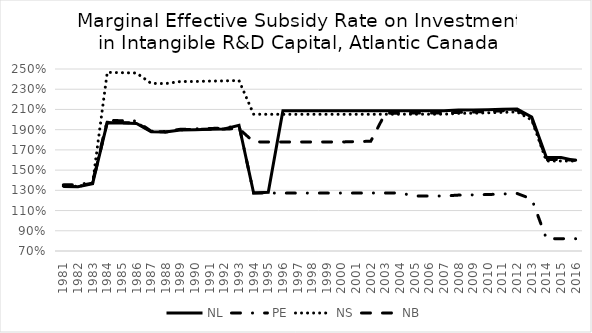
| Category | NL | PE | NS | NB |
|---|---|---|---|---|
| 1981.0 | 1.339 | 1.354 | 1.346 | 1.342 |
| 1982.0 | 1.336 | 1.354 | 1.339 | 1.342 |
| 1983.0 | 1.366 | 1.382 | 1.369 | 1.372 |
| 1984.0 | 1.97 | 1.992 | 2.467 | 1.974 |
| 1985.0 | 1.966 | 1.989 | 2.463 | 1.97 |
| 1986.0 | 1.962 | 1.986 | 2.46 | 1.966 |
| 1987.0 | 1.88 | 1.885 | 2.358 | 1.885 |
| 1988.0 | 1.877 | 1.883 | 2.356 | 1.877 |
| 1989.0 | 1.897 | 1.904 | 2.376 | 1.9 |
| 1990.0 | 1.9 | 1.908 | 2.376 | 1.904 |
| 1991.0 | 1.904 | 1.912 | 2.38 | 1.904 |
| 1992.0 | 1.906 | 1.914 | 2.382 | 1.906 |
| 1993.0 | 1.943 | 1.943 | 2.386 | 1.91 |
| 1994.0 | 1.274 | 1.274 | 2.053 | 1.779 |
| 1995.0 | 1.281 | 1.273 | 2.052 | 1.778 |
| 1996.0 | 2.087 | 1.273 | 2.052 | 1.778 |
| 1997.0 | 2.087 | 1.273 | 2.052 | 1.778 |
| 1998.0 | 2.087 | 1.273 | 2.052 | 1.778 |
| 1999.0 | 2.087 | 1.273 | 2.052 | 1.778 |
| 2000.0 | 2.087 | 1.273 | 2.052 | 1.778 |
| 2001.0 | 2.087 | 1.273 | 2.052 | 1.782 |
| 2002.0 | 2.088 | 1.273 | 2.052 | 1.785 |
| 2003.0 | 2.088 | 1.274 | 2.053 | 2.063 |
| 2004.0 | 2.088 | 1.274 | 2.053 | 2.064 |
| 2005.0 | 2.088 | 1.244 | 2.053 | 2.064 |
| 2006.0 | 2.088 | 1.244 | 2.053 | 2.064 |
| 2007.0 | 2.088 | 1.244 | 2.053 | 2.064 |
| 2008.0 | 2.094 | 1.253 | 2.061 | 2.071 |
| 2009.0 | 2.095 | 1.255 | 2.063 | 2.074 |
| 2010.0 | 2.098 | 1.258 | 2.066 | 2.08 |
| 2011.0 | 2.101 | 1.264 | 2.071 | 2.088 |
| 2012.0 | 2.105 | 1.269 | 2.076 | 2.093 |
| 2013.0 | 2.024 | 1.214 | 1.995 | 2.009 |
| 2014.0 | 1.624 | 0.822 | 1.59 | 1.604 |
| 2015.0 | 1.624 | 0.822 | 1.59 | 1.604 |
| 2016.0 | 1.594 | 0.822 | 1.59 | 1.599 |